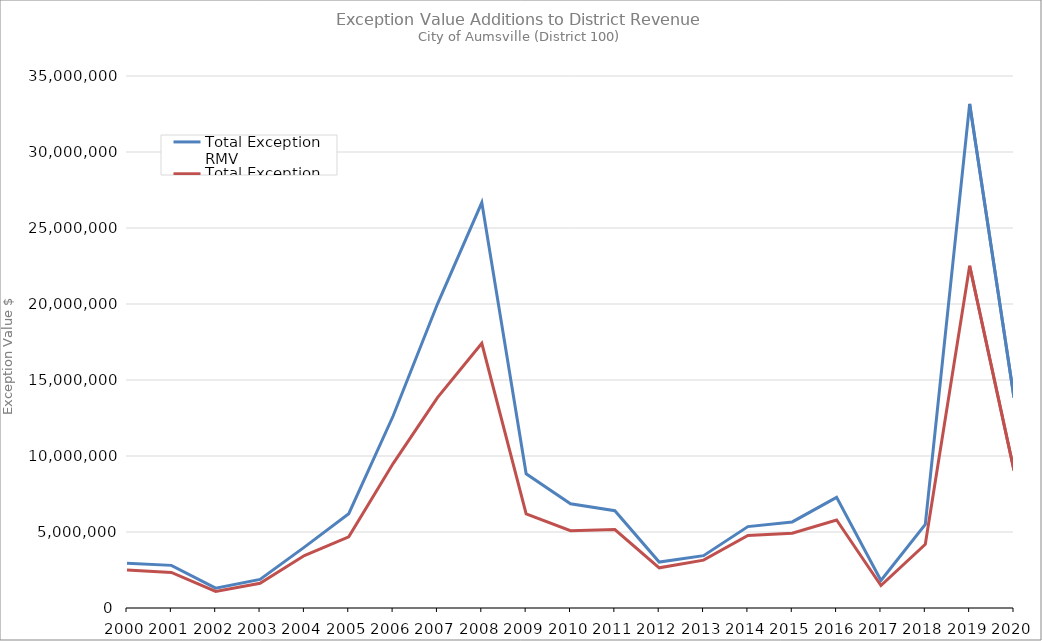
| Category | Total Exception RMV | Total Exception MAV |
|---|---|---|
| 2000.0 | 2948513 | 2504446 |
| 2001.0 | 2804255 | 2341450 |
| 2002.0 | 1302572 | 1086522 |
| 2003.0 | 1882712 | 1630183 |
| 2004.0 | 4004868 | 3448165 |
| 2005.0 | 6205450 | 4685160 |
| 2006.0 | 12630900 | 9501941 |
| 2007.0 | 19995501 | 13841419 |
| 2008.0 | 26670228 | 17413668 |
| 2009.0 | 8832101 | 6195039 |
| 2010.0 | 6861359 | 5086910 |
| 2011.0 | 6402926 | 5156973 |
| 2012.0 | 3021511 | 2645014 |
| 2013.0 | 3443710 | 3147890 |
| 2014.0 | 5355206 | 4768250 |
| 2015.0 | 5662237 | 4917717 |
| 2016.0 | 7281367 | 5792034 |
| 2017.0 | 1814476 | 1479616 |
| 2018.0 | 5493990 | 4187504 |
| 2019.0 | 33164730 | 22516208 |
| 2020.0 | 13838322 | 9043056 |